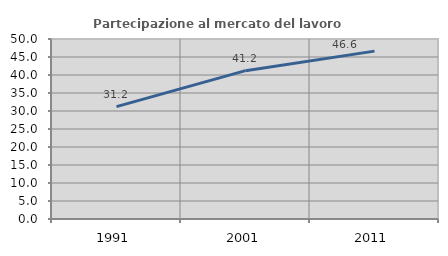
| Category | Partecipazione al mercato del lavoro  femminile |
|---|---|
| 1991.0 | 31.201 |
| 2001.0 | 41.21 |
| 2011.0 | 46.629 |